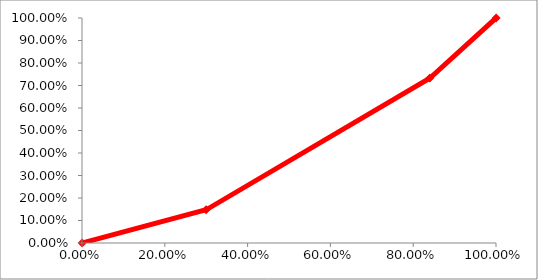
| Category | Series 0 |
|---|---|
| 0.0 | 0 |
| 0.3 | 0.148 |
| 0.84 | 0.732 |
| 1.0 | 1 |